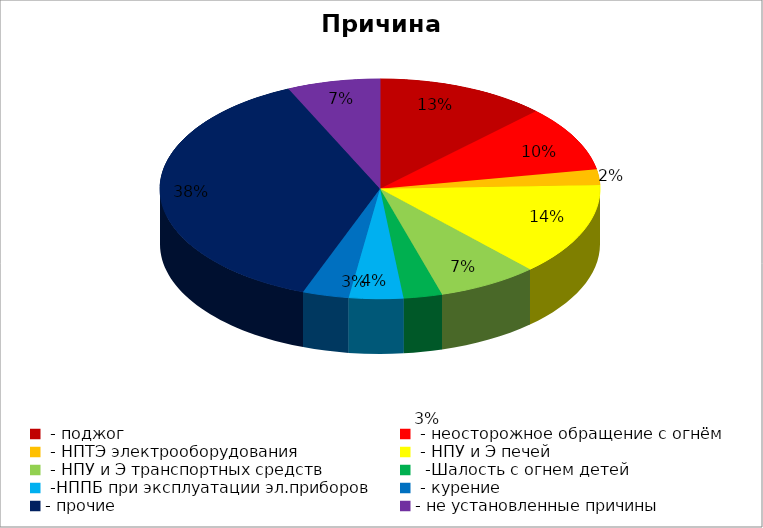
| Category | Причина пожара |
|---|---|
|  - поджог | 22 |
|  - неосторожное обращение с огнём | 17 |
|  - НПТЭ электрооборудования | 4 |
|  - НПУ и Э печей | 24 |
|  - НПУ и Э транспортных средств | 13 |
|   -Шалость с огнем детей | 5 |
|  -НППБ при эксплуатации эл.приборов | 7 |
|  - курение | 6 |
| - прочие | 66 |
| - не установленные причины | 12 |